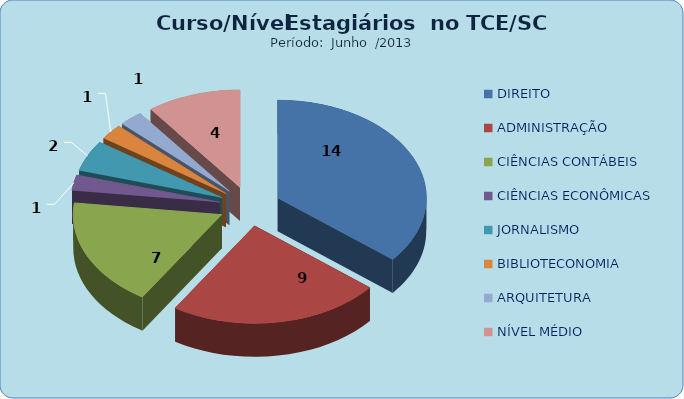
| Category | Series 0 |
|---|---|
| DIREITO | 14 |
| ADMINISTRAÇÃO | 9 |
| CIÊNCIAS CONTÁBEIS | 7 |
| CIÊNCIAS ECONÔMICAS | 1 |
| JORNALISMO | 2 |
| BIBLIOTECONOMIA | 1 |
| ARQUITETURA | 1 |
| NÍVEL MÉDIO | 4 |